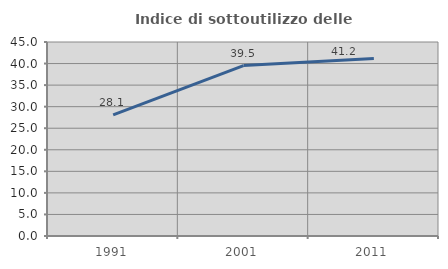
| Category | Indice di sottoutilizzo delle abitazioni  |
|---|---|
| 1991.0 | 28.088 |
| 2001.0 | 39.54 |
| 2011.0 | 41.17 |